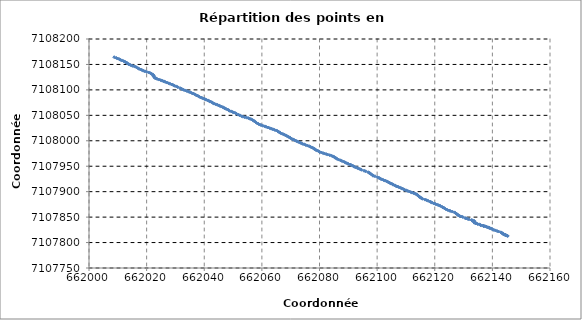
| Category | Series 0 |
|---|---|
| 662145.315 | 7107812.935 |
| 662145.168 | 7107813.369 |
| 662144.627 | 7107815.013 |
| 662144.578 | 7107814.728 |
| 662144.54 | 7107814.34 |
| 662144.273 | 7107815.457 |
| 662144.242 | 7107815.707 |
| 662143.918 | 7107816.43 |
| 662143.811 | 7107817.099 |
| 662143.711 | 7107816.8 |
| 662143.547 | 7107818.129 |
| 662143.363 | 7107818.625 |
| 662142.93 | 7107820.119 |
| 662142.137 | 7107821.665 |
| 662141.658 | 7107822.511 |
| 662141.072 | 7107823.882 |
| 662140.563 | 7107824.667 |
| 662139.963 | 7107826.134 |
| 662139.716 | 7107827.272 |
| 662139.313 | 7107827.982 |
| 662138.947 | 7107828.627 |
| 662138.884 | 7107829.263 |
| 662138.585 | 7107829.618 |
| 662138.476 | 7107829.895 |
| 662138.077 | 7107830.615 |
| 662137.784 | 7107831.451 |
| 662137.485 | 7107831.892 |
| 662137.066 | 7107832.226 |
| 662137.011 | 7107832.46 |
| 662136.946 | 7107832.953 |
| 662136.545 | 7107833.359 |
| 662135.98 | 7107833.876 |
| 662135.825 | 7107834.776 |
| 662135.443 | 7107835.775 |
| 662134.853 | 7107836.436 |
| 662134.463 | 7107837.407 |
| 662134.24 | 7107837.808 |
| 662134.127 | 7107838.45 |
| 662133.803 | 7107840.712 |
| 662133.767 | 7107838.81 |
| 662133.667 | 7107842.564 |
| 662133.647 | 7107839.769 |
| 662133.642 | 7107841.717 |
| 662133.532 | 7107842.268 |
| 662133.152 | 7107842.862 |
| 662132.885 | 7107843.608 |
| 662132.853 | 7107844.331 |
| 662131.88 | 7107845.725 |
| 662131.439 | 7107846.581 |
| 662130.863 | 7107847.385 |
| 662130.509 | 7107848.262 |
| 662129.714 | 7107850.206 |
| 662129.277 | 7107851.193 |
| 662128.678 | 7107852.131 |
| 662128.355 | 7107853.097 |
| 662128.052 | 7107854.099 |
| 662127.86 | 7107855.136 |
| 662127.473 | 7107857.057 |
| 662127.172 | 7107858.168 |
| 662126.815 | 7107859.287 |
| 662126.084 | 7107860.877 |
| 662125.354 | 7107861.948 |
| 662125.06 | 7107862.896 |
| 662124.427 | 7107864.087 |
| 662123.737 | 7107865.922 |
| 662123.271 | 7107867.844 |
| 662122.905 | 7107868.854 |
| 662122.622 | 7107869.945 |
| 662121.941 | 7107871.872 |
| 662121.58 | 7107872.901 |
| 662121.115 | 7107873.936 |
| 662120.619 | 7107874.879 |
| 662120.218 | 7107875.939 |
| 662119.7 | 7107876.923 |
| 662119.095 | 7107878.355 |
| 662118.638 | 7107879.436 |
| 662118.458 | 7107880.508 |
| 662117.727 | 7107881.95 |
| 662117.146 | 7107883.317 |
| 662116.624 | 7107884.331 |
| 662115.764 | 7107886.017 |
| 662115.466 | 7107886.995 |
| 662115.151 | 7107888.06 |
| 662114.877 | 7107889.073 |
| 662114.627 | 7107890.207 |
| 662114.369 | 7107891.488 |
| 662114.111 | 7107892.716 |
| 662113.892 | 7107893.919 |
| 662113.629 | 7107894.94 |
| 662113.269 | 7107895.926 |
| 662112.692 | 7107897.024 |
| 662112.161 | 7107898.092 |
| 662111.686 | 7107899.126 |
| 662111.159 | 7107900.309 |
| 662110.641 | 7107901.409 |
| 662110.055 | 7107902.626 |
| 662109.528 | 7107903.747 |
| 662109.134 | 7107904.887 |
| 662108.705 | 7107905.981 |
| 662108.284 | 7107907.147 |
| 662107.8 | 7107908.319 |
| 662107.38 | 7107909.344 |
| 662106.916 | 7107910.126 |
| 662106.504 | 7107911.228 |
| 662106.102 | 7107912.516 |
| 662105.562 | 7107913.628 |
| 662105.318 | 7107914.798 |
| 662104.867 | 7107915.772 |
| 662104.432 | 7107916.98 |
| 662104.098 | 7107918.007 |
| 662103.727 | 7107919.318 |
| 662103.266 | 7107920.438 |
| 662102.801 | 7107921.676 |
| 662102.223 | 7107922.752 |
| 662101.752 | 7107923.991 |
| 662101.294 | 7107925.032 |
| 662100.825 | 7107926.351 |
| 662100.608 | 7107927.429 |
| 662100.051 | 7107928.524 |
| 662099.231 | 7107930.423 |
| 662098.581 | 7107931.234 |
| 662098.4 | 7107932.503 |
| 662097.92 | 7107934.184 |
| 662097.521 | 7107936.118 |
| 662097.222 | 7107937.129 |
| 662096.893 | 7107938.218 |
| 662095.98 | 7107940.131 |
| 662095.465 | 7107941.077 |
| 662094.582 | 7107943.005 |
| 662094.081 | 7107944.203 |
| 662093.621 | 7107945.39 |
| 662093.129 | 7107946.439 |
| 662092.541 | 7107947.796 |
| 662092.089 | 7107948.897 |
| 662091.771 | 7107950.026 |
| 662091.452 | 7107951.152 |
| 662090.97 | 7107952.333 |
| 662090.608 | 7107953.325 |
| 662089.983 | 7107954.563 |
| 662089.604 | 7107955.568 |
| 662089.142 | 7107956.814 |
| 662088.753 | 7107957.948 |
| 662088.314 | 7107959.149 |
| 662087.748 | 7107960.441 |
| 662087.238 | 7107961.635 |
| 662086.611 | 7107963.043 |
| 662086.095 | 7107964.432 |
| 662085.768 | 7107965.725 |
| 662085.379 | 7107966.863 |
| 662085.132 | 7107968.145 |
| 662084.712 | 7107969.237 |
| 662084.236 | 7107970.55 |
| 662083.563 | 7107971.672 |
| 662082.847 | 7107972.889 |
| 662082.319 | 7107973.835 |
| 662081.739 | 7107974.901 |
| 662081.236 | 7107975.778 |
| 662080.64 | 7107976.924 |
| 662080.055 | 7107978.198 |
| 662079.653 | 7107979.533 |
| 662079.24 | 7107980.723 |
| 662078.719 | 7107981.987 |
| 662078.445 | 7107983.265 |
| 662078.113 | 7107984.418 |
| 662077.797 | 7107985.579 |
| 662077.342 | 7107986.844 |
| 662076.899 | 7107988.12 |
| 662076.408 | 7107989.353 |
| 662075.809 | 7107990.526 |
| 662075.209 | 7107991.695 |
| 662074.669 | 7107992.974 |
| 662074.104 | 7107994.032 |
| 662073.591 | 7107995.323 |
| 662073.175 | 7107996.483 |
| 662072.638 | 7107997.71 |
| 662072.128 | 7107999.092 |
| 662071.757 | 7108000.18 |
| 662071.274 | 7108001.525 |
| 662070.75 | 7108002.786 |
| 662070.323 | 7108004.016 |
| 662069.889 | 7108005.365 |
| 662069.631 | 7108006.541 |
| 662069.245 | 7108007.859 |
| 662068.724 | 7108009.191 |
| 662068.296 | 7108010.553 |
| 662067.862 | 7108011.891 |
| 662067.382 | 7108012.957 |
| 662066.898 | 7108014.155 |
| 662066.422 | 7108015.461 |
| 662066.093 | 7108016.529 |
| 662065.801 | 7108017.841 |
| 662065.425 | 7108019.085 |
| 662064.995 | 7108020.246 |
| 662064.417 | 7108021.439 |
| 662063.798 | 7108022.659 |
| 662063.292 | 7108023.727 |
| 662062.737 | 7108024.84 |
| 662062.143 | 7108026.094 |
| 662061.494 | 7108027.307 |
| 662060.999 | 7108028.387 |
| 662060.344 | 7108029.51 |
| 662059.713 | 7108030.682 |
| 662059.255 | 7108031.89 |
| 662058.843 | 7108033.048 |
| 662058.459 | 7108033.979 |
| 662057.964 | 7108036.016 |
| 662057.486 | 7108038.112 |
| 662057.157 | 7108039.479 |
| 662056.789 | 7108040.9 |
| 662056.287 | 7108042.265 |
| 662055.845 | 7108043.392 |
| 662055.325 | 7108044.498 |
| 662054.756 | 7108045.383 |
| 662054.094 | 7108046.254 |
| 662053.448 | 7108047.297 |
| 662052.956 | 7108048.257 |
| 662052.31 | 7108050.101 |
| 662051.799 | 7108051.313 |
| 662051.177 | 7108053.147 |
| 662050.832 | 7108054.343 |
| 662050.286 | 7108055.466 |
| 662049.872 | 7108056.576 |
| 662049.339 | 7108057.754 |
| 662048.738 | 7108058.902 |
| 662048.462 | 7108060.121 |
| 662048.119 | 7108061.314 |
| 662047.586 | 7108062.634 |
| 662047.121 | 7108063.824 |
| 662046.785 | 7108065.036 |
| 662046.465 | 7108066.049 |
| 662045.936 | 7108067.225 |
| 662045.461 | 7108068.343 |
| 662045.019 | 7108069.515 |
| 662044.55 | 7108070.702 |
| 662043.952 | 7108071.735 |
| 662043.374 | 7108073.059 |
| 662043.043 | 7108074.08 |
| 662042.568 | 7108075.938 |
| 662042.049 | 7108076.996 |
| 662041.66 | 7108078.251 |
| 662041.24 | 7108079.379 |
| 662040.683 | 7108080.618 |
| 662040.222 | 7108081.808 |
| 662039.799 | 7108082.857 |
| 662039.29 | 7108083.921 |
| 662038.821 | 7108085.025 |
| 662038.343 | 7108086.42 |
| 662037.913 | 7108087.719 |
| 662037.447 | 7108088.945 |
| 662037.045 | 7108090.303 |
| 662036.612 | 7108091.507 |
| 662036.118 | 7108092.827 |
| 662035.622 | 7108094.093 |
| 662035.075 | 7108095.286 |
| 662034.595 | 7108096.446 |
| 662033.991 | 7108097.673 |
| 662033.416 | 7108098.911 |
| 662032.843 | 7108100.142 |
| 662032.269 | 7108101.446 |
| 662031.894 | 7108102.624 |
| 662031.583 | 7108103.643 |
| 662030.75 | 7108105.495 |
| 662030.302 | 7108106.868 |
| 662029.694 | 7108108.069 |
| 662029.25 | 7108109.297 |
| 662028.774 | 7108110.591 |
| 662028.155 | 7108111.866 |
| 662027.63 | 7108112.98 |
| 662027.024 | 7108114.429 |
| 662026.45 | 7108115.649 |
| 662025.96 | 7108116.846 |
| 662025.459 | 7108117.951 |
| 662024.883 | 7108119.091 |
| 662024.25 | 7108120.272 |
| 662023.644 | 7108121.551 |
| 662023.214 | 7108122.63 |
| 662022.793 | 7108123.611 |
| 662022.526 | 7108125.759 |
| 662022.505 | 7108126.885 |
| 662022.428 | 7108128.112 |
| 662022.244 | 7108129.266 |
| 662022.053 | 7108130.419 |
| 662021.722 | 7108131.621 |
| 662021.308 | 7108132.903 |
| 662020.751 | 7108134.209 |
| 662020.048 | 7108135.416 |
| 662019.396 | 7108136.512 |
| 662018.864 | 7108137.675 |
| 662018.36 | 7108139.001 |
| 662017.946 | 7108140.081 |
| 662017.394 | 7108141.282 |
| 662017.026 | 7108142.439 |
| 662016.449 | 7108144.524 |
| 662015.969 | 7108145.757 |
| 662015.286 | 7108146.858 |
| 662014.842 | 7108147.765 |
| 662014.363 | 7108149.01 |
| 662013.831 | 7108150.247 |
| 662013.441 | 7108151.571 |
| 662013.209 | 7108152.632 |
| 662012.933 | 7108153.821 |
| 662012.542 | 7108155.105 |
| 662012.004 | 7108156.565 |
| 662011.369 | 7108157.894 |
| 662010.928 | 7108159.111 |
| 662010.492 | 7108160.379 |
| 662009.978 | 7108161.611 |
| 662009.515 | 7108162.75 |
| 662008.762 | 7108164.18 |